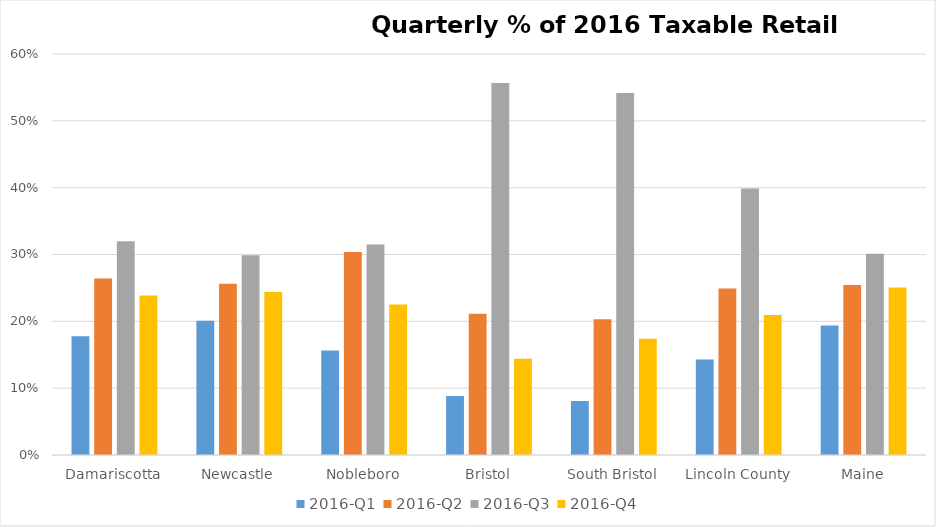
| Category | 2016-Q1 | 2016-Q2 | 2016-Q3 | 2016-Q4 |
|---|---|---|---|---|
| Damariscotta | 0.178 | 0.264 | 0.32 | 0.239 |
| Newcastle | 0.201 | 0.256 | 0.299 | 0.244 |
| Nobleboro | 0.156 | 0.304 | 0.315 | 0.225 |
| Bristol | 0.088 | 0.211 | 0.556 | 0.144 |
| South Bristol | 0.081 | 0.203 | 0.542 | 0.174 |
| Lincoln County | 0.143 | 0.249 | 0.399 | 0.209 |
| Maine | 0.194 | 0.254 | 0.301 | 0.251 |